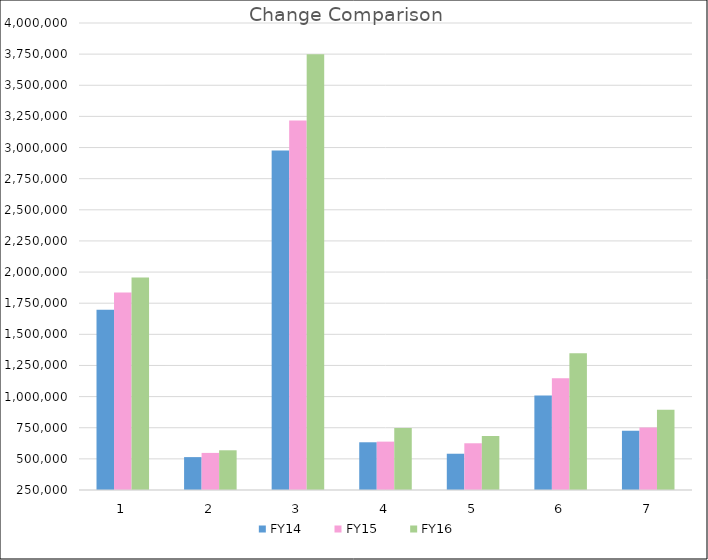
| Category | FY14 | FY15 | FY16 |
|---|---|---|---|
| 0 | 1697413.69 | 1835663.78 | 1956207.58 |
| 1 | 514097.08 | 547790.16 | 568881.62 |
| 2 | 2975568.42 | 3217944.64 | 3749759.45 |
| 3 | 633266.07 | 638402.21 | 747903.05 |
| 4 | 541250.65 | 625195.14 | 683574.92 |
| 5 | 1009130.99 | 1146939.29 | 1347396.22 |
| 6 | 726546.4 | 751460.76 | 893765.83 |